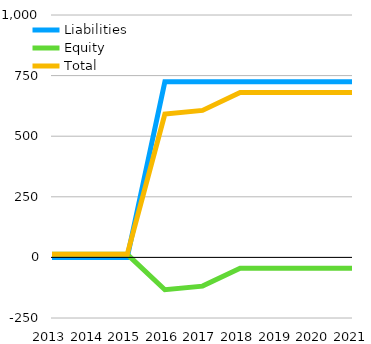
| Category | Liabilities  | Equity  | Total |
|---|---|---|---|
| 2013 | 0 | 12.5 | 12.5 |
| 2014 | 0 | 12.5 | 12.5 |
| 2015 | 0 | 12.5 | 12.5 |
| 2016 | 725 | -133.5 | 591.5 |
| 2017 | 725 | -118.5 | 606.5 |
| 2018 | 725 | -44.5 | 680.5 |
| 2019 | 725 | -44.5 | 680.5 |
| 2020 | 725 | -44.5 | 680.5 |
| 2021 | 725 | -44.5 | 680.5 |